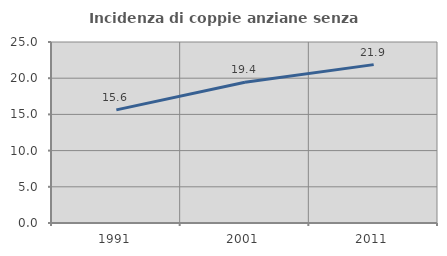
| Category | Incidenza di coppie anziane senza figli  |
|---|---|
| 1991.0 | 15.625 |
| 2001.0 | 19.444 |
| 2011.0 | 21.875 |